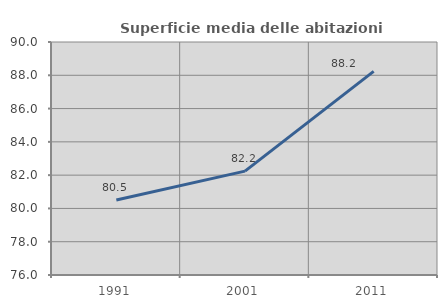
| Category | Superficie media delle abitazioni occupate |
|---|---|
| 1991.0 | 80.502 |
| 2001.0 | 82.244 |
| 2011.0 | 88.231 |